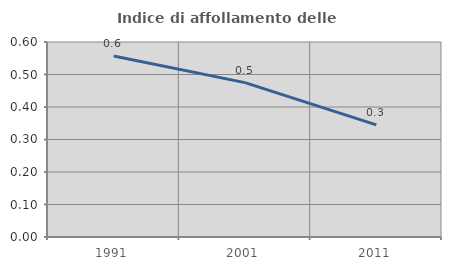
| Category | Indice di affollamento delle abitazioni  |
|---|---|
| 1991.0 | 0.557 |
| 2001.0 | 0.475 |
| 2011.0 | 0.345 |